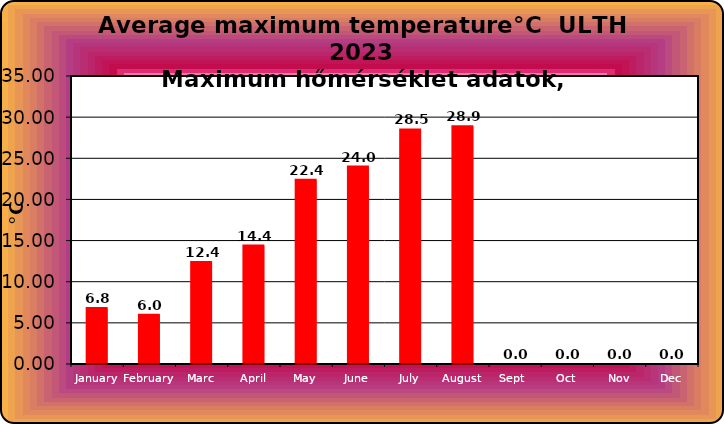
| Category | Series 0 |
|---|---|
| January | 6.8 |
| February | 6 |
| Marc | 12.4 |
| April | 14.4 |
| May | 22.4 |
| June | 24 |
| July | 28.5 |
| August | 28.9 |
| Sept  | 0 |
| Oct | 0 |
| Nov | 0 |
| Dec | 0 |